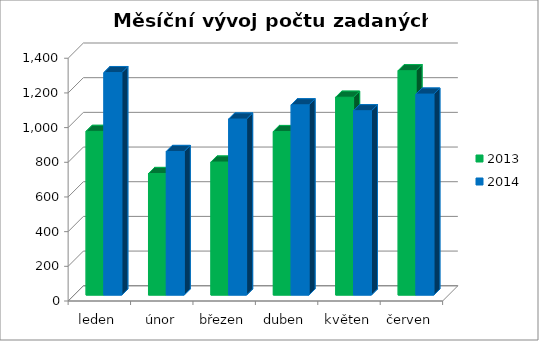
| Category | 2013 | 2014 |
|---|---|---|
| leden | 944 | 1283 |
| únor | 701 | 828 |
| březen | 767 | 1015 |
| duben | 943 | 1097 |
| květen | 1141 | 1063 |
| červen | 1294 | 1159 |